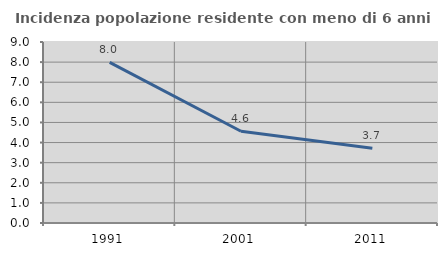
| Category | Incidenza popolazione residente con meno di 6 anni |
|---|---|
| 1991.0 | 7.985 |
| 2001.0 | 4.563 |
| 2011.0 | 3.718 |